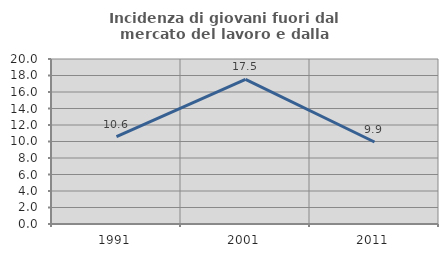
| Category | Incidenza di giovani fuori dal mercato del lavoro e dalla formazione  |
|---|---|
| 1991.0 | 10.596 |
| 2001.0 | 17.518 |
| 2011.0 | 9.939 |